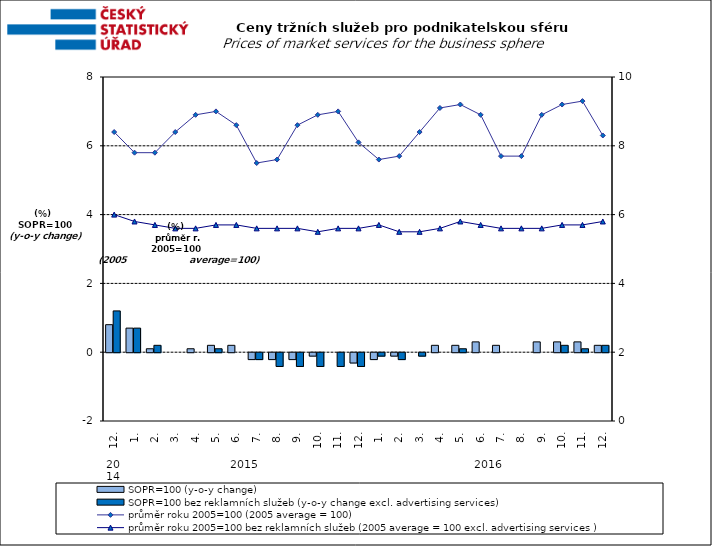
| Category | SOPR=100 (y-o-y change)   | SOPR=100 bez reklamních služeb (y-o-y change excl. advertising services)   |
|---|---|---|
| 0 | 0.8 | 1.2 |
| 1 | 0.7 | 0.7 |
| 2 | 0.1 | 0.2 |
| 3 | 0 | 0 |
| 4 | 0.1 | 0 |
| 5 | 0.2 | 0.1 |
| 6 | 0.2 | 0 |
| 7 | -0.2 | -0.2 |
| 8 | -0.2 | -0.4 |
| 9 | -0.2 | -0.4 |
| 10 | -0.1 | -0.4 |
| 11 | 0 | -0.4 |
| 12 | -0.3 | -0.4 |
| 13 | -0.2 | -0.1 |
| 14 | -0.1 | -0.2 |
| 15 | 0 | -0.1 |
| 16 | 0.2 | 0 |
| 17 | 0.2 | 0.1 |
| 18 | 0.3 | 0 |
| 19 | 0.2 | 0 |
| 20 | 0 | 0 |
| 21 | 0.3 | 0 |
| 22 | 0.3 | 0.2 |
| 23 | 0.3 | 0.1 |
| 24 | 0.2 | 0.2 |